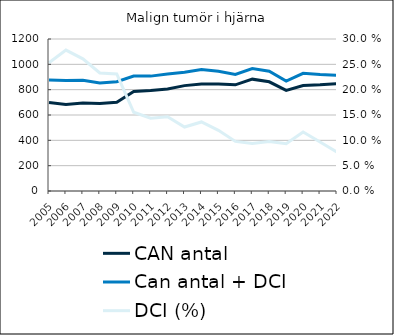
| Category |  CAN antal  |  Can antal + DCI  |
|---|---|---|
| 2005.0 | 699 | 876 |
| 2006.0 | 683 | 873 |
| 2007.0 | 694 | 875 |
| 2008.0 | 691 | 852 |
| 2009.0 | 701 | 863 |
| 2010.0 | 785 | 907 |
| 2011.0 | 793 | 907 |
| 2012.0 | 806 | 924 |
| 2013.0 | 832 | 937 |
| 2014.0 | 844 | 959 |
| 2015.0 | 844 | 945 |
| 2016.0 | 838 | 920 |
| 2017.0 | 883 | 966 |
| 2018.0 | 862 | 946 |
| 2019.0 | 794 | 868 |
| 2020.0 | 832 | 929 |
| 2021.0 | 838 | 919 |
| 2022.0 | 848 | 913 |